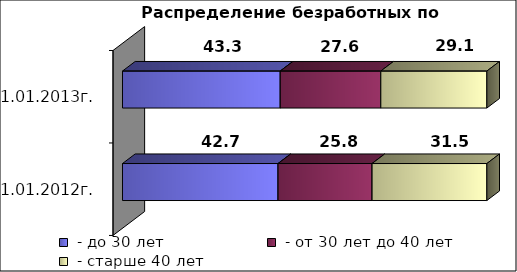
| Category |  - до 30 лет  |  - от 30 лет до 40 лет  |  - старше 40 лет  |
|---|---|---|---|
| на 01.01.2012г. | 42.7 | 25.8 | 31.5 |
| на 01.01.2013г. | 43.3 | 27.6 | 29.1 |